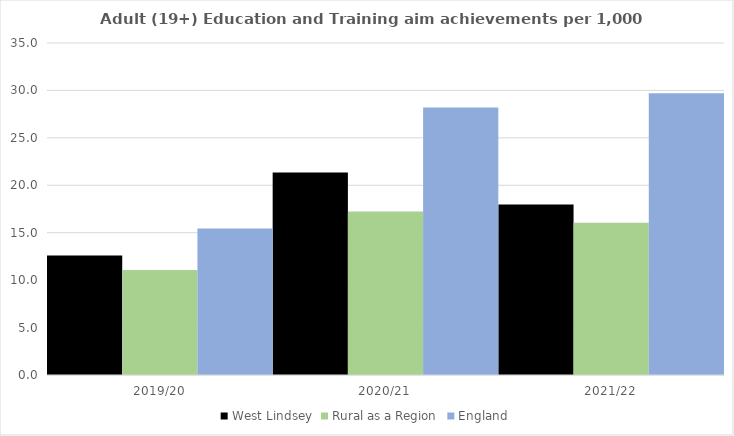
| Category | West Lindsey | Rural as a Region | England |
|---|---|---|---|
| 2019/20 | 12.595 | 11.081 | 15.446 |
| 2020/21 | 21.339 | 17.224 | 28.211 |
| 2021/22 | 17.981 | 16.063 | 29.711 |